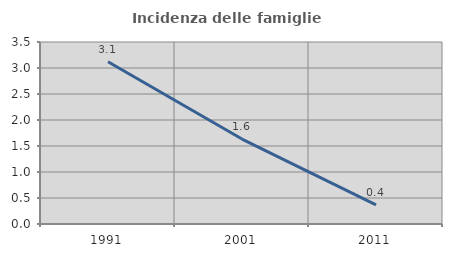
| Category | Incidenza delle famiglie numerose |
|---|---|
| 1991.0 | 3.12 |
| 2001.0 | 1.634 |
| 2011.0 | 0.369 |